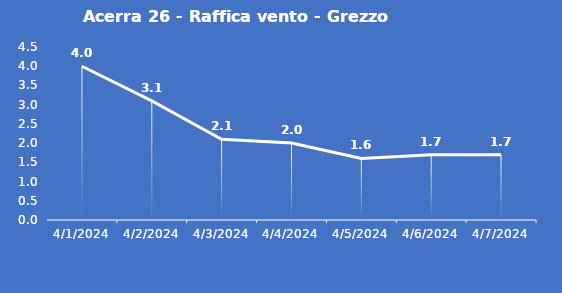
| Category | Acerra 26 - Raffica vento - Grezzo (m/s) |
|---|---|
| 4/1/24 | 4 |
| 4/2/24 | 3.1 |
| 4/3/24 | 2.1 |
| 4/4/24 | 2 |
| 4/5/24 | 1.6 |
| 4/6/24 | 1.7 |
| 4/7/24 | 1.7 |